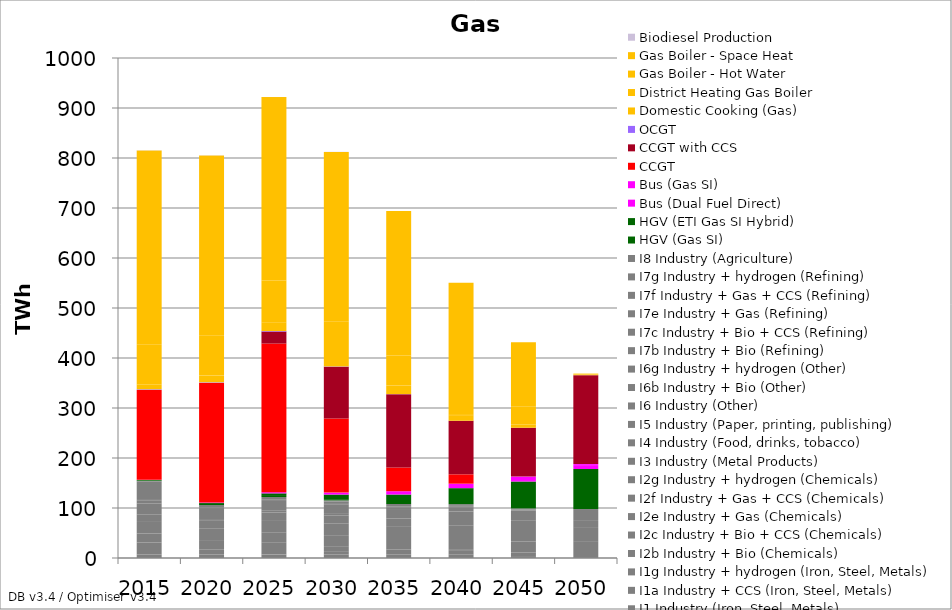
| Category | I1 Industry (Iron, Steel, Metals) | I1a Industry + CCS (Iron, Steel, Metals) | I1g Industry + hydrogen (Iron, Steel, Metals) | I2b Industry + Bio (Chemicals) | I2c Industry + Bio + CCS (Chemicals) | I2e Industry + Gas (Chemicals) | I2f Industry + Gas + CCS (Chemicals) | I2g Industry + hydrogen (Chemicals) | I3 Industry (Metal Products) | I4 Industry (Food, drinks, tobacco) | I5 Industry (Paper, printing, publishing) | I6 Industry (Other) | I6b Industry + Bio (Other) | I6g Industry + hydrogen (Other) | I7b Industry + Bio (Refining) | I7c Industry + Bio + CCS (Refining) | I7e Industry + Gas (Refining) | I7f Industry + Gas + CCS (Refining) | I7g Industry + hydrogen (Refining) | I8 Industry (Agriculture) | HGV (Gas SI) | HGV (ETI Gas SI Hybrid) | Bus (Dual Fuel Direct) | Bus (Gas SI) | CCGT | CCGT with CCS | OCGT | Domestic Cooking (Gas) | District Heating Gas Boiler | Gas Boiler - Hot Water | Gas Boiler - Space Heat | Biodiesel Production |
|---|---|---|---|---|---|---|---|---|---|---|---|---|---|---|---|---|---|---|---|---|---|---|---|---|---|---|---|---|---|---|---|---|
| 2015.0 | 6.899 | 0 | 0 | 0 | 0 | 24.029 | 0 | 0 | 18.175 | 23.006 | 14.441 | 22.176 | 6.79 | 0 | 0.607 | 0 | 36.483 | 0 | 0 | 1.981 | 1.436 | 0 | 0 | 0.421 | 179.568 | 0 | 1.361 | 9.718 | 0.019 | 79.192 | 388.946 | 0.308 |
| 2020.0 | 7.033 | 0 | 0 | 8.999 | 0 | 0.549 | 0 | 0 | 19.274 | 23.661 | 14.82 | 3.542 | 20.196 | 0 | 2.386 | 0 | 3.553 | 0 | 0 | 1.996 | 3.866 | 0 | 0 | 1.133 | 239.145 | 0 | 1.159 | 13.523 | 0.05 | 79.485 | 360.814 | 0.308 |
| 2025.0 | 6.871 | 0 | 0 | 0 | 0.664 | 0 | 24.067 | 0 | 19.915 | 24.347 | 15.04 | 3.539 | 19.744 | 0 | 2.278 | 0.027 | 0 | 3.498 | 0 | 2.01 | 3.866 | 3.42 | 0 | 2.337 | 297.319 | 24.067 | 1.011 | 16.587 | 0.093 | 84.219 | 366.874 | 0.077 |
| 2030.0 | 0 | 6.809 | 0 | 0 | 5.486 | 0 | 11.384 | 0 | 20.664 | 25.058 | 15.286 | 3.53 | 19.34 | 0 | 0 | 2.224 | 0 | 3.43 | 0 | 2.023 | 2.43 | 9.201 | 0 | 3.947 | 148.172 | 103.5 | 0.62 | 16.974 | 0.143 | 72.474 | 339.296 | 0.308 |
| 2035.0 | 0 | 6.667 | 0 | 0 | 9.456 | 0 | 0.61 | 0 | 21.254 | 25.768 | 15.428 | 0 | 18.751 | 2.52 | 0 | 2.144 | 0 | 3.359 | 0 | 2.035 | 0 | 18.955 | 0 | 6.653 | 47.438 | 146.501 | 0.27 | 17.26 | 0.298 | 59.652 | 288.936 | 0 |
| 2040.0 | 0 | 6.583 | 0 | 0 | 9.121 | 0 | 0.591 | 0 | 21.679 | 26.485 | 15.558 | 0 | 12.868 | 7.536 | 0 | 2.065 | 0 | 3.197 | 0.003 | 2.045 | 0 | 31.958 | 0 | 9.006 | 18.674 | 107.17 | 0 | 11.156 | 0.474 | 57.847 | 206.733 | 0 |
| 2045.0 | 0 | 0 | 1.939 | 0 | 0.195 | 0 | 0 | 8.637 | 22.008 | 27.208 | 15.626 | 0 | 0 | 19.383 | 0 | 1.987 | 0 | 0 | 0.178 | 2.055 | 0 | 53.772 | 2.897 | 6.975 | 0 | 97.684 | 0 | 5.609 | 0.599 | 36.717 | 128.105 | 0 |
| 2050.0 | 0 | 0 | 1.907 | 0 | 0 | 0 | 0 | 8.102 | 22.216 | 27.937 | 15.644 | 0 | 0 | 18.176 | 0 | 0 | 0 | 0 | 2.08 | 2.064 | 0 | 79.89 | 6.213 | 3.557 | 0 | 177.914 | 0 | 0 | 1.055 | 0.146 | 1.919 | 0 |